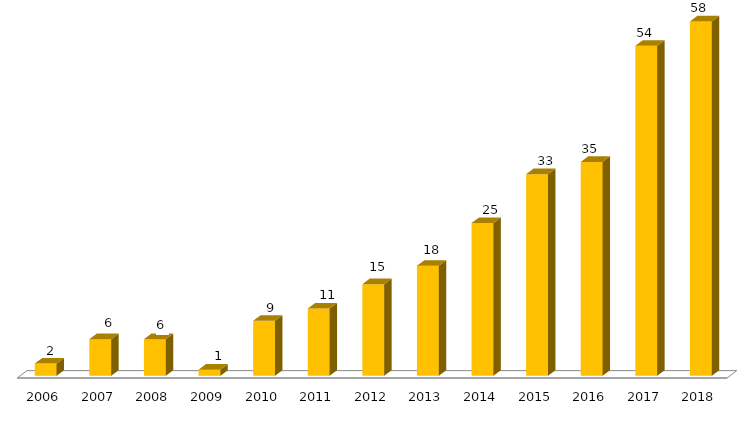
| Category | Monografias - Artigos Científicos / Dissertações / Teses |
|---|---|
| 2006.0 | 2 |
| 2007.0 | 6 |
| 2008.0 | 6 |
| 2009.0 | 1 |
| 2010.0 | 9 |
| 2011.0 | 11 |
| 2012.0 | 15 |
| 2013.0 | 18 |
| 2014.0 | 25 |
| 2015.0 | 33 |
| 2016.0 | 35 |
| 2017.0 | 54 |
| 2018.0 | 58 |